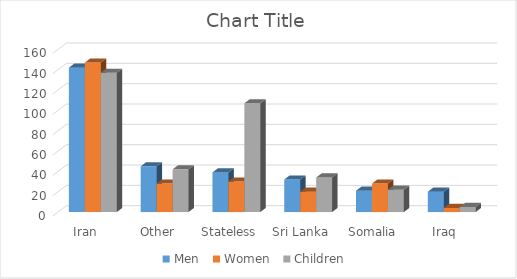
| Category | Men  | Women  | Children  |
|---|---|---|---|
| Iran  | 142 | 147 | 137 |
| Other  | 45 | 28 | 42 |
| Stateless  | 39 | 30 | 107 |
| Sri Lanka  | 32 | 20 | 34 |
| Somalia  | 21 | 28 | 22 |
| Iraq  | 20 | 4 | 5 |